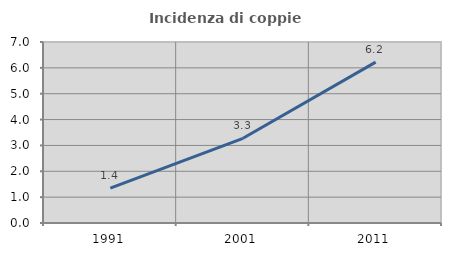
| Category | Incidenza di coppie miste |
|---|---|
| 1991.0 | 1.351 |
| 2001.0 | 3.276 |
| 2011.0 | 6.223 |